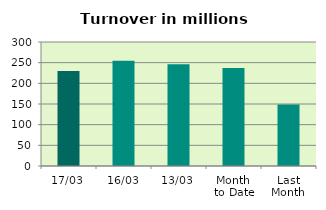
| Category | Series 0 |
|---|---|
| 17/03 | 229.744 |
| 16/03 | 254.475 |
| 13/03 | 246.012 |
| Month 
to Date | 237.15 |
| Last
Month | 148.578 |